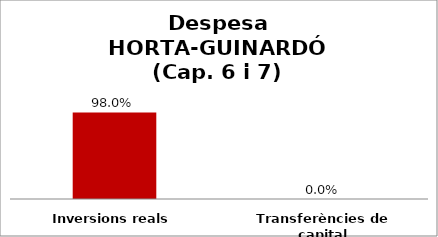
| Category | Series 0 |
|---|---|
| Inversions reals | 0.98 |
| Transferències de capital | 0 |